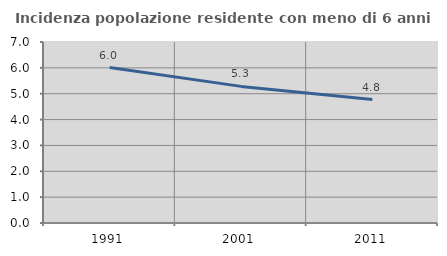
| Category | Incidenza popolazione residente con meno di 6 anni |
|---|---|
| 1991.0 | 6.013 |
| 2001.0 | 5.283 |
| 2011.0 | 4.774 |